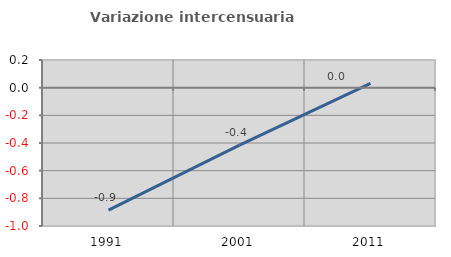
| Category | Variazione intercensuaria annua |
|---|---|
| 1991.0 | -0.885 |
| 2001.0 | -0.415 |
| 2011.0 | 0.031 |